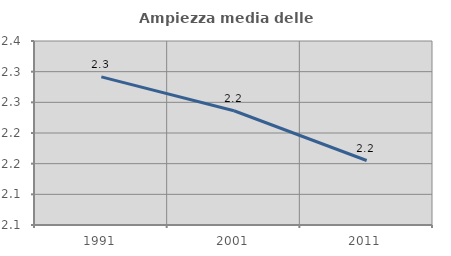
| Category | Ampiezza media delle famiglie |
|---|---|
| 1991.0 | 2.292 |
| 2001.0 | 2.236 |
| 2011.0 | 2.155 |